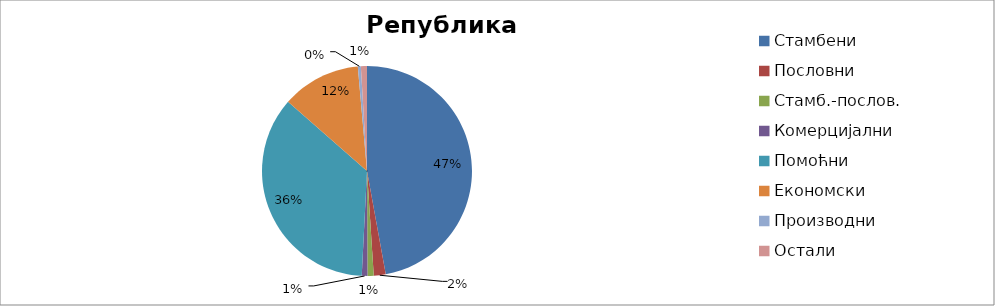
| Category | Series 0 |
|---|---|
| Стамбени | 940656 |
| Пословни | 36612 |
| Стамб.-послов. | 18918 |
| Комерцијални | 17470 |
| Помоћни | 711450 |
| Економски | 242475 |
| Производни | 9260 |
| Остали | 18594 |